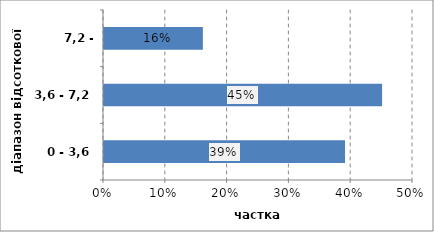
| Category | Series 0 |
|---|---|
| 0 - 3,6 | 0.39 |
| 3,6 - 7,2 | 0.45 |
| 7,2 - 10,9 | 0.16 |